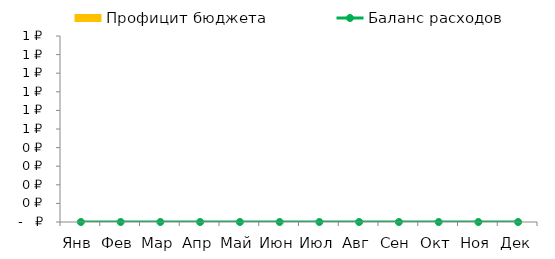
| Category | Профицит бюджета |
|---|---|
| Янв | 0 |
| Фев | 0 |
| Мар | 0 |
| Апр | 0 |
| Май | 0 |
| Июн | 0 |
| Июл | 0 |
| Авг | 0 |
| Сен | 0 |
| Окт | 0 |
| Ноя | 0 |
| Дек | 0 |